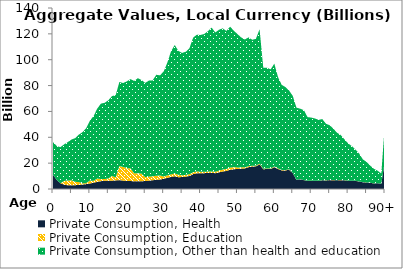
| Category | Private Consumption, Health | Private Consumption, Education | Private Consumption, Other than health and education |
|---|---|---|---|
| 0 | 11040.185 | 0 | 25231.098 |
|  | 7075.4 | 0 | 26231.497 |
| 2 | 4431.671 | 0 | 27914.487 |
| 3 | 3419.393 | 2813.051 | 28294.246 |
| 4 | 2862.313 | 3768.584 | 29621.068 |
| 5 | 2872.307 | 3834.537 | 31521.538 |
| 6 | 2929.362 | 2653.977 | 33763.461 |
| 7 | 3197.893 | 2139.357 | 36706.259 |
| 8 | 3448.401 | 904.816 | 39650.773 |
| 9 | 3792.775 | 713.91 | 42559.661 |
| 10 | 4233.319 | 2279.669 | 46343.713 |
| 11 | 4881.664 | 1471.001 | 50069.172 |
| 12 | 5493.193 | 2642.294 | 54105.281 |
| 13 | 6074.677 | 1618.814 | 58364.553 |
| 14 | 6364.371 | 1297.713 | 59001.278 |
| 15 | 6426.021 | 1802.864 | 60405.492 |
| 16 | 6415.564 | 3615.977 | 61837.098 |
| 17 | 6635.3 | 2441.725 | 63600.872 |
| 18 | 6877.015 | 10919.72 | 65002.63 |
| 19 | 6453.974 | 10634.698 | 64865.742 |
| 20 | 6252.734 | 9885.3 | 67117.154 |
| 21 | 6122.151 | 9956.268 | 68930.928 |
| 22 | 6035.325 | 6058.407 | 71486.226 |
| 23 | 6025.641 | 6073.838 | 73621.122 |
| 24 | 6047.687 | 5835.096 | 72412.471 |
| 25 | 6124.502 | 3129.897 | 72814.417 |
| 26 | 6443.002 | 3125.404 | 74298.46 |
| 27 | 6789.77 | 3060.154 | 74167.654 |
| 28 | 7094.933 | 3182.507 | 78075.769 |
| 29 | 7320.391 | 3113.5 | 77465.359 |
| 30 | 7916.896 | 1774.887 | 81203.068 |
| 31 | 8651.089 | 1893.054 | 87255.904 |
| 32 | 9337.454 | 2026.86 | 95149.938 |
| 33 | 9821.045 | 2081.567 | 99510.968 |
| 34 | 9118.236 | 1965.813 | 95683.925 |
| 35 | 9234.828 | 1359.744 | 94654.798 |
| 36 | 9571.675 | 1369.751 | 95251.04 |
| 37 | 10083.325 | 1397.694 | 97556.606 |
| 38 | 11526.187 | 1467.09 | 104154.861 |
| 39 | 12129.512 | 1458.023 | 105752.268 |
| 40 | 12268.043 | 1056.727 | 105820.395 |
| 41 | 12252.049 | 1029.111 | 106634.527 |
| 42 | 12422.94 | 1053.278 | 108596.305 |
| 43 | 12479.275 | 1106.499 | 111225.13 |
| 44 | 12228.687 | 1148.118 | 107733.268 |
| 45 | 12842.751 | 1324.925 | 109010.134 |
| 46 | 13540.896 | 1496.205 | 109232.96 |
| 47 | 13963.326 | 1581.554 | 106710.974 |
| 48 | 14830.423 | 1695.206 | 109039.649 |
| 49 | 15283.692 | 1633.933 | 105574.508 |
| 50 | 15508.294 | 1141.402 | 103173.627 |
| 51 | 15722.998 | 989.37 | 100569.457 |
| 52 | 15928.41 | 855.18 | 98852.157 |
| 53 | 16860.151 | 748.66 | 99663.141 |
| 54 | 17336.749 | 631.223 | 97491.137 |
| 55 | 17524.761 | 557.836 | 98036.04 |
| 56 | 19036.302 | 551.142 | 103992.46 |
| 57 | 15308.868 | 408.475 | 78141.357 |
| 58 | 15437.293 | 409.513 | 77986.261 |
| 59 | 15429.539 | 436.43 | 76692.623 |
| 60 | 16934.352 | 508.39 | 79512.997 |
| 61 | 15468.12 | 463.866 | 70602.645 |
| 62 | 14370.417 | 399.592 | 65777.467 |
| 63 | 14314.443 | 353.671 | 64166.922 |
| 64 | 14938.891 | 273.755 | 60953.386 |
| 65 | 12234.718 | 131.917 | 59617.59 |
| 66 | 6983.896 | 95.268 | 55847.144 |
| 67 | 7522.489 | 80.953 | 54509.542 |
| 68 | 6848.923 | 72.005 | 54115.33 |
| 69 | 6270.919 | 64.634 | 49271.114 |
| 70 | 6232.415 | 66.811 | 48958.362 |
| 71 | 6403.519 | 71.775 | 48091.403 |
| 72 | 6194.122 | 79.652 | 47216.641 |
| 73 | 6727.596 | 94.618 | 47255.05 |
| 74 | 6587.074 | 105.231 | 43790.285 |
| 75 | 6881.775 | 99.364 | 42347.61 |
| 76 | 6783.042 | 114.085 | 39749.921 |
| 77 | 6699.411 | 122.882 | 36692.225 |
| 78 | 6865.13 | 132.569 | 34784.528 |
| 79 | 6671.446 | 137.301 | 31658.806 |
| 80 | 6352.616 | 127.202 | 28868.854 |
| 81 | 6288.834 | 120.508 | 26795.221 |
| 82 | 6277.218 | 111.058 | 24170.374 |
| 83 | 5772.081 | 101.493 | 21552.979 |
| 84 | 5207.222 | 85.185 | 17627.873 |
| 85 | 5028.718 | 79.17 | 15901.775 |
| 86 | 4815.118 | 67.653 | 13187.912 |
| 87 | 4268.341 | 59.692 | 11260.83 |
| 88 | 4449.713 | 52.982 | 9660.279 |
| 89 | 4006.214 | 45.083 | 7960.162 |
| 90+ | 22150.858 | 170.267 | 29150.477 |